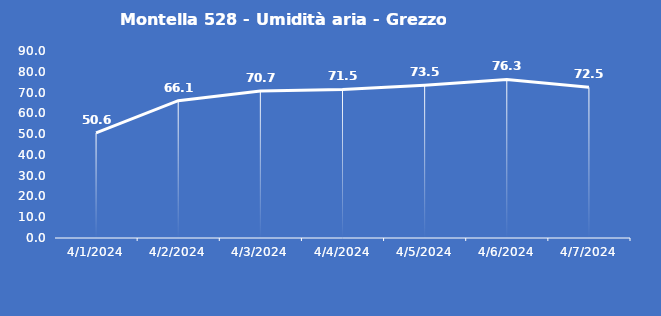
| Category | Montella 528 - Umidità aria - Grezzo (%) |
|---|---|
| 4/1/24 | 50.6 |
| 4/2/24 | 66.1 |
| 4/3/24 | 70.7 |
| 4/4/24 | 71.5 |
| 4/5/24 | 73.5 |
| 4/6/24 | 76.3 |
| 4/7/24 | 72.5 |